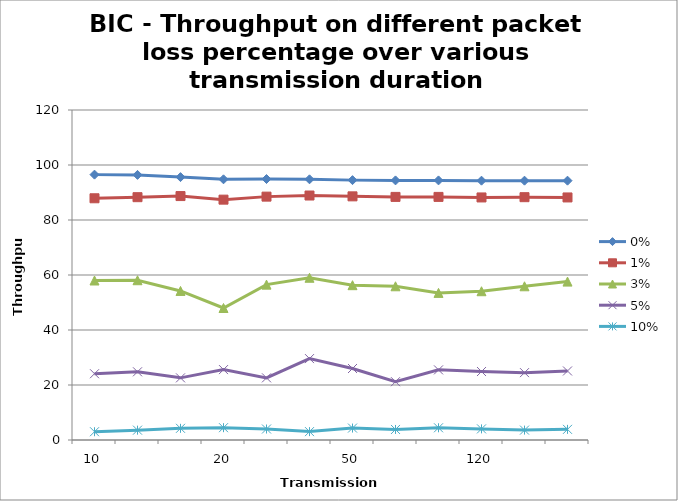
| Category | 0% | 1% | 3% | 5% | 10% |
|---|---|---|---|---|---|
| 10.0 | 96.5 | 87.9 | 58 | 24.1 | 3.01 |
| nan | 96.4 | 88.3 | 58.1 | 24.8 | 3.58 |
| nan | 95.6 | 88.7 | 54.2 | 22.6 | 4.25 |
| 20.0 | 94.8 | 87.4 | 48 | 25.6 | 4.48 |
| nan | 94.9 | 88.5 | 56.5 | 22.6 | 4 |
| nan | 94.8 | 88.9 | 59 | 29.6 | 3.05 |
| 50.0 | 94.5 | 88.6 | 56.3 | 26 | 4.34 |
| nan | 94.4 | 88.4 | 55.9 | 21.2 | 3.83 |
| nan | 94.4 | 88.4 | 53.5 | 25.5 | 4.44 |
| 120.0 | 94.3 | 88.2 | 54.1 | 24.9 | 4.04 |
| nan | 94.3 | 88.3 | 55.9 | 24.5 | 3.6 |
| nan | 94.3 | 88.2 | 57.6 | 25.1 | 3.87 |